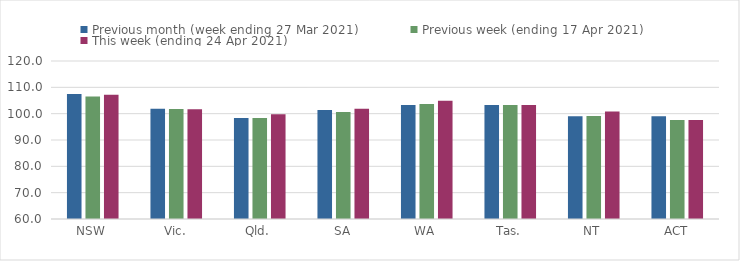
| Category | Previous month (week ending 27 Mar 2021) | Previous week (ending 17 Apr 2021) | This week (ending 24 Apr 2021) |
|---|---|---|---|
| NSW | 107.48 | 106.53 | 107.15 |
| Vic. | 101.83 | 101.74 | 101.71 |
| Qld. | 98.36 | 98.33 | 99.74 |
| SA | 101.37 | 100.65 | 101.82 |
| WA | 103.3 | 103.65 | 104.86 |
| Tas. | 103.32 | 103.32 | 103.32 |
| NT | 99 | 99.1 | 100.87 |
| ACT | 99.02 | 97.59 | 97.59 |